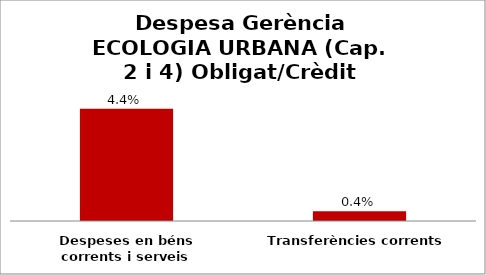
| Category | Series 0 |
|---|---|
| Despeses en béns corrents i serveis | 0.044 |
| Transferències corrents | 0.004 |